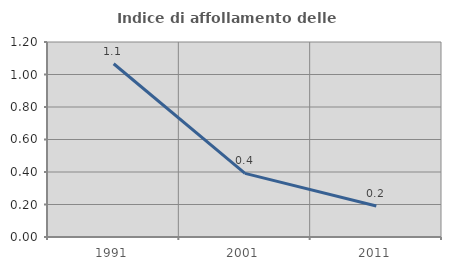
| Category | Indice di affollamento delle abitazioni  |
|---|---|
| 1991.0 | 1.066 |
| 2001.0 | 0.391 |
| 2011.0 | 0.191 |